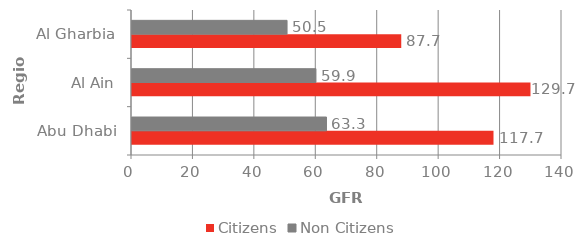
| Category | Citizens | Non Citizens |
|---|---|---|
| Abu Dhabi | 117.7 | 63.321 |
| Al Ain | 129.738 | 59.89 |
| Al Gharbia | 87.664 | 50.482 |